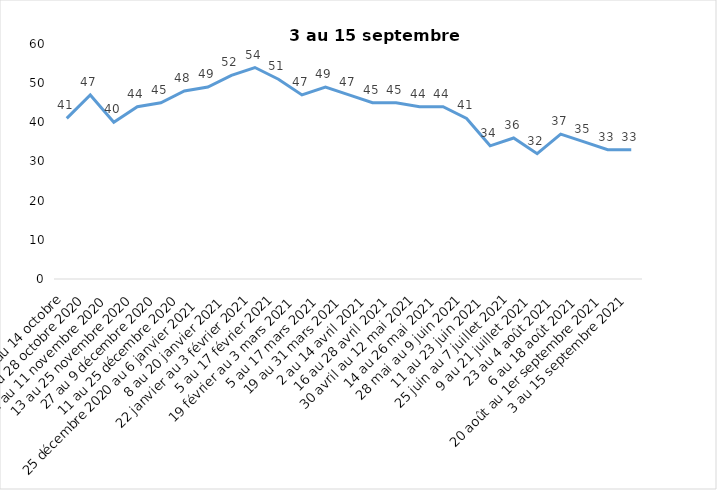
| Category | Toujours aux trois mesures |
|---|---|
| 2 au 14 octobre | 41 |
| 16 au 28 octobre 2020 | 47 |
| 30 octobre au 11 novembre 2020 | 40 |
| 13 au 25 novembre 2020 | 44 |
| 27 au 9 décembre 2020 | 45 |
| 11 au 25 décembre 2020 | 48 |
| 25 décembre 2020 au 6 janvier 2021 | 49 |
| 8 au 20 janvier 2021 | 52 |
| 22 janvier au 3 février 2021 | 54 |
| 5 au 17 février 2021 | 51 |
| 19 février au 3 mars 2021 | 47 |
| 5 au 17 mars 2021 | 49 |
| 19 au 31 mars 2021 | 47 |
| 2 au 14 avril 2021 | 45 |
| 16 au 28 avril 2021 | 45 |
| 30 avril au 12 mai 2021 | 44 |
| 14 au 26 mai 2021 | 44 |
| 28 mai au 9 juin 2021 | 41 |
| 11 au 23 juin 2021 | 34 |
| 25 juin au 7 juillet 2021 | 36 |
| 9 au 21 juillet 2021 | 32 |
| 23 au 4 août 2021 | 37 |
| 6 au 18 août 2021 | 35 |
| 20 août au 1er septembre 2021 | 33 |
| 3 au 15 septembre 2021 | 33 |